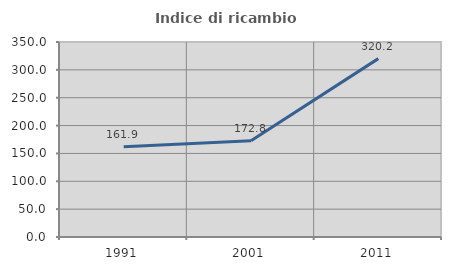
| Category | Indice di ricambio occupazionale  |
|---|---|
| 1991.0 | 161.932 |
| 2001.0 | 172.821 |
| 2011.0 | 320.168 |